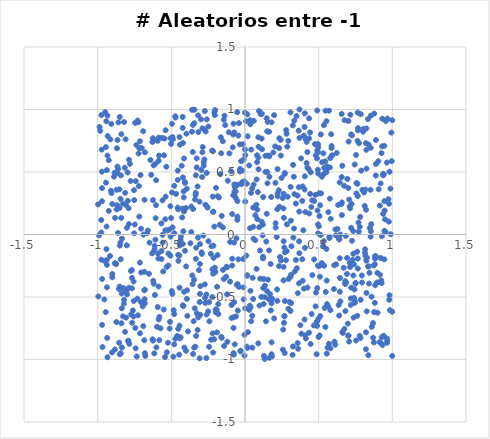
| Category | Y |
|---|---|
| 0.2941494130794362 | 0.749 |
| 0.5414493482163687 | -0.588 |
| 0.8208104533130691 | 0.731 |
| -0.7924378228535878 | -0.849 |
| 0.5660289205656317 | 0.179 |
| -0.2671827902955777 | 0.824 |
| 0.3671700671999589 | -0.055 |
| 0.8987338431680711 | -0.307 |
| -0.6790496207109624 | 0.658 |
| -0.9439417812696314 | 0.7 |
| 0.9457393925962683 | -0.199 |
| -0.4373616848154729 | -0.043 |
| -0.07798164039639421 | 0.886 |
| 0.23072688172821088 | -0.253 |
| -0.7129389091545362 | 0.746 |
| -0.5231780994365782 | -0.866 |
| 0.04167682645095594 | 0.679 |
| 0.5013568381594551 | 0.066 |
| 0.2946855053844022 | -0.594 |
| 0.7658177464501605 | -0.192 |
| -0.31884595823467743 | -0.025 |
| 0.6163008782579018 | -0.007 |
| -0.5589206364381119 | -0.003 |
| 0.4748370309225174 | 0.723 |
| 0.6922112292820968 | -0.316 |
| -0.43473672491951443 | -0.016 |
| 0.6858875232697872 | -0.383 |
| 0.5923150215027637 | 0.633 |
| 0.49559760242313455 | 0.081 |
| 0.5759438931337597 | 0.287 |
| -0.3178183942800692 | 0.953 |
| 0.05641747083701021 | 0.062 |
| 0.5304703597563405 | -0.092 |
| 0.8079325371352861 | 0.336 |
| -0.2948543363129059 | -0.143 |
| -0.32188102782502304 | 0.384 |
| 0.0901054042940097 | -0.871 |
| -0.5389449371655033 | 0.834 |
| 0.5347108882758353 | 0.483 |
| 0.5848068977406009 | 0.802 |
| 0.9645657466205084 | -0.834 |
| 0.24796686821780445 | 0.453 |
| 0.36860751882657894 | -0.15 |
| -0.9697983240072179 | -0.356 |
| -0.4072869910445944 | -0.13 |
| 0.34956815488259885 | 0.947 |
| 0.007054451618637048 | 0.906 |
| 0.8604706242656734 | -0.739 |
| -0.3270904979770859 | -0.63 |
| 0.22936429356155363 | 0.354 |
| -0.9702967598521233 | 0.371 |
| 0.1514140917897564 | 0.5 |
| -0.5406096847180217 | 0.034 |
| 0.7131013687680712 | -0.26 |
| -0.9244185582309628 | 0.188 |
| -0.8004876663058214 | -0.479 |
| -0.9332747468915192 | 0.631 |
| 0.7204610522994797 | 0.8 |
| -0.2161044862942112 | 0.181 |
| -0.48627947891581647 | -0.977 |
| -0.8714737017085814 | 0.358 |
| 0.8764794807394773 | -0.621 |
| -0.2084166517363104 | 0.063 |
| 0.9287063329001071 | -0.014 |
| 0.88772011152882 | 0.472 |
| 0.6836709033454063 | -0.011 |
| -0.10577644653767404 | 0.649 |
| -0.7132605972327757 | -0.225 |
| 0.0013785702516131426 | 0.264 |
| -0.8833312912085758 | -0.229 |
| 0.5738703648616248 | -0.018 |
| 0.7928659448768893 | -0.328 |
| 0.3573833167143916 | -0.868 |
| 0.2693691020571214 | -0.948 |
| -0.9725147209216434 | 0.679 |
| 0.33480268678534086 | 0.911 |
| 0.3355167295967101 | 0.323 |
| 0.0702704360791937 | 0.154 |
| -0.7415804376125115 | 0.427 |
| -0.8819305192997813 | 0.133 |
| 0.9989290111648346 | -0.618 |
| -0.34280294161997515 | 0.998 |
| 0.49452638566962714 | 0.724 |
| 0.7010940298745183 | -0.808 |
| 0.6699284308734952 | -0.266 |
| -0.35735726047236915 | -0.327 |
| 0.1780601958300121 | 0.3 |
| -0.5015936511686496 | 0.132 |
| -0.0033845683994755404 | -0.802 |
| -0.3281288050563784 | 0.536 |
| 0.5878899123216339 | 0.708 |
| -0.03274545779325022 | 0.524 |
| -0.8523883184804628 | 0.361 |
| -0.06931753221383197 | -0.879 |
| 0.12866613361052592 | -0.972 |
| -0.8219231337582773 | -0.554 |
| -0.10080917151735447 | -0.059 |
| 0.8407396339160662 | -0.255 |
| 0.31146610487606696 | 0.111 |
| -0.5676426134254695 | 0.088 |
| 0.7633102596971277 | 0.406 |
| 0.028574259294429805 | -0.603 |
| -0.5866596318878008 | -0.416 |
| 0.9332915562173341 | -0.884 |
| 0.011979607241968226 | 0.406 |
| 0.7351104742186261 | -0.154 |
| -0.15044991178704636 | 0.746 |
| -0.07210795115514634 | 0.401 |
| 0.9557779598713079 | 0.908 |
| 0.14744043795579986 | 0.166 |
| -0.5012336067100376 | 0.725 |
| -0.17204240914324886 | 0.078 |
| 0.8126387245789706 | 0.229 |
| -0.13899645886734602 | 0.95 |
| 0.736997108781061 | -0.665 |
| -0.7291420319080582 | 0.912 |
| 0.43133307587631275 | 0.524 |
| 0.0012385483504593342 | -0.591 |
| -0.6904648629504171 | -0.733 |
| -0.4952569459788645 | 0.885 |
| -0.3997298236667757 | -0.255 |
| 0.38062238974700024 | 0.609 |
| 0.6815513358850109 | -0.612 |
| 0.2044713037266217 | 0.705 |
| -0.35416771838566063 | 0.66 |
| 0.7021365197299614 | 0.908 |
| 0.6758531517969757 | 0.915 |
| -0.8653099374213666 | 0.756 |
| -0.8157605110711752 | 0.534 |
| -0.8421113068447197 | 0.473 |
| 0.434208232194895 | -0.786 |
| 0.49657766488010324 | 0.009 |
| 0.49040131870418535 | -0.429 |
| -0.7547878223694957 | -0.532 |
| 0.23393698745245328 | 0.222 |
| 0.29575547337516417 | -0.356 |
| 0.4526375677129286 | -0.636 |
| -0.7874529708112661 | 0.598 |
| -0.41844732509718696 | 0.026 |
| -0.36460715351106354 | 0.019 |
| -0.765746533767899 | -0.706 |
| -0.004711407466996942 | 0.425 |
| -0.8366640728620827 | -0.472 |
| 0.3453342777184427 | 0.248 |
| -0.6305666209458503 | -0.151 |
| 0.5163394727606188 | 0.329 |
| 0.962827926247791 | 0.576 |
| 0.6574568843754054 | 0.155 |
| -0.2589509817931628 | 0.225 |
| -0.5858090166204573 | 0.59 |
| -0.06147509578301569 | -0.655 |
| 0.12212526202574092 | -0.178 |
| 0.4046856789335114 | 0.359 |
| -0.9745837103797226 | 0.955 |
| -0.029614888024345642 | -0.929 |
| 0.06951572874897383 | -0.045 |
| -0.4210857373163681 | 0.732 |
| -0.9972209202026208 | 0.241 |
| -0.4531974818429354 | -0.755 |
| 0.2209677186046446 | 0.523 |
| 0.0983100606133942 | -0.568 |
| -0.8349275044207383 | -0.033 |
| 0.9378113821919136 | 0.165 |
| -0.29065566617032124 | 0.46 |
| 0.7659377112046553 | -0.272 |
| -0.2928155157093091 | -0.156 |
| 0.219049707893598 | 0.202 |
| -0.18957813863346806 | -0.783 |
| 0.6568446798789043 | 0.459 |
| 0.23333163008629998 | 0.77 |
| -0.14936066871321763 | -0.283 |
| 0.0553566992657597 | -0.516 |
| 0.4095257327356905 | -0.807 |
| -0.7851903944160497 | -0.875 |
| -0.2598987013655405 | 0.493 |
| -0.07342639757615865 | 0.817 |
| -0.736709142227757 | 0.715 |
| -0.4446067214718925 | -0.73 |
| -0.3058007101448552 | -0.236 |
| -0.3351724174825075 | 0.317 |
| -0.16742701348701794 | 0.483 |
| -0.2692857283388703 | 0.238 |
| 0.6437812750708298 | -0.458 |
| 0.7881913678978303 | 0.511 |
| 0.1978693567442289 | 0.955 |
| -0.46787237360164413 | 0.325 |
| 0.38878532589503423 | -0.198 |
| 0.8967410030158152 | -0.384 |
| -0.44539266880183526 | -0.168 |
| 0.4902682691923286 | -0.693 |
| 0.5084637023227156 | -0.338 |
| -0.6647255493049915 | 0.011 |
| 0.5353198469675113 | 0.874 |
| -0.4567885995501002 | 0.215 |
| 0.5656676650799637 | -0.576 |
| 0.9204727914920099 | 0.409 |
| -0.9954708641485539 | -0.496 |
| 0.09175033486806217 | 0.522 |
| -0.8091956248623642 | 0.237 |
| -0.044956538631860665 | 0.792 |
| 0.09659416664685039 | 0.058 |
| 0.32480664033373285 | 0.873 |
| -0.05281644905485927 | 0.979 |
| -0.5856328510474915 | 0.775 |
| 0.11381467846516635 | 0.102 |
| -0.8657678068550723 | 0.543 |
| 0.1504218978563865 | 0.825 |
| -0.3443556614001748 | 0.89 |
| -0.7561492785144592 | -0.376 |
| -0.6193630913185058 | 0.756 |
| 0.26784705592783653 | -0.655 |
| 0.41285736701166953 | -0.832 |
| -0.5049326166747421 | -0.017 |
| -0.9439764218751125 | 0.415 |
| -0.7872159740249809 | -0.426 |
| 0.5449583491771164 | 0.585 |
| -0.060482224239664095 | 0.288 |
| -0.8239061912474623 | -0.43 |
| -0.3872533731981853 | -0.775 |
| -0.659441917833709 | 0.032 |
| -0.4161126555911392 | 0.345 |
| -0.8712022629372183 | 0.201 |
| -0.624052747321258 | -0.849 |
| 0.35685539159960067 | 0.312 |
| 0.7503142433664463 | -0.393 |
| -0.2213612156217939 | -0.279 |
| 0.2898021834848481 | 0.302 |
| 0.4364266611400045 | 0.168 |
| -0.550189377908965 | 0.634 |
| -0.05165452222863265 | 0.267 |
| 0.11394104110349312 | 0.966 |
| -0.20087763147829008 | -0.299 |
| -0.20435672306786912 | -0.266 |
| -0.5626055963799041 | 0.773 |
| -0.07190155389811381 | 0.315 |
| -0.541217755216683 | 0.122 |
| 0.44638941227204154 | 0.497 |
| 0.8270604397528845 | -0.186 |
| -0.05599529070161968 | -0.402 |
| -0.39422526611958375 | -0.515 |
| 0.7788913285174874 | -0.811 |
| 0.2648904651487871 | -0.707 |
| 0.570212026823921 | -0.875 |
| -0.5339331442394069 | 0.542 |
| 0.9267245588470863 | 0.651 |
| 0.2153554116039187 | -0.02 |
| 0.4062158769240998 | 0.465 |
| -0.06307819646508706 | 0.345 |
| -0.26231607583653394 | -0.988 |
| 0.41103777309896117 | 0.764 |
| -0.4726825110515869 | 0.945 |
| 0.720841257033328 | -0.425 |
| -0.1983188927238242 | -0.623 |
| 0.7857239576159991 | 0.963 |
| 0.6277978374705198 | 0.044 |
| -0.8502936939734458 | -0.959 |
| 0.8237057517691786 | -0.209 |
| -0.8433332293289701 | -0.198 |
| -0.9547504281597816 | -0.519 |
| 0.30908383606617296 | -0.612 |
| 0.7786659293482008 | 0.062 |
| -0.4227001667323189 | 0.853 |
| -0.07598765835515509 | -0.961 |
| -0.18941257382971477 | -0.418 |
| -0.8447515357196853 | 0.285 |
| 0.6930337091831447 | -0.188 |
| -0.6033378375986787 | 0.435 |
| -0.42144481548381085 | -0.566 |
| -0.7520456727357983 | 0.01 |
| 0.6464385775638337 | 0 |
| 0.2821801345041932 | 0.806 |
| 0.7837779396507254 | -0.828 |
| 0.48610527520731184 | -0.958 |
| -0.49263664742340296 | 0.779 |
| -0.4176769739682664 | -0.573 |
| -0.8209951082866698 | 0.9 |
| -0.47288639768549623 | -0.834 |
| -0.09156903607088784 | -0.564 |
| -0.44229344665169323 | -0.087 |
| -0.8541525070628351 | -0.866 |
| 0.5731714208878256 | -0.028 |
| -0.9753771909443314 | 0.116 |
| -0.3590107713094286 | 0.998 |
| 0.08189144584670993 | 0.634 |
| -0.3342093444684098 | 0.333 |
| 0.2592216435234116 | -0.76 |
| -0.42201738440349024 | -0.075 |
| 0.821627093574828 | 0.198 |
| -0.08046514692905538 | 0.8 |
| -0.8455943444698235 | -0.065 |
| 0.36986794349497876 | 1 |
| -0.3938768236338488 | -0.447 |
| 0.4778114201472372 | 0.317 |
| 0.19234402082711788 | 0.656 |
| 0.10240375269366742 | -0.128 |
| 0.12257927327912155 | -0.191 |
| -0.9381952695860551 | -0.204 |
| -0.511511367703344 | -0.753 |
| 0.21922985988034438 | -0.531 |
| -0.1967385770812935 | 0.374 |
| -0.4539777623047363 | 0.202 |
| -0.05225063448173528 | 0.117 |
| 0.9994935783152501 | -0.972 |
| -0.7203235962750827 | 0.387 |
| -0.3913691376804662 | -0.651 |
| -0.21730980118497745 | 0.667 |
| -0.9496401387413953 | -0.214 |
| 0.10533228398069872 | 0.976 |
| 0.3094316002870161 | 0.381 |
| -0.2429258943304493 | -0.542 |
| 0.6374323181789967 | -0.035 |
| 0.09072592424952841 | 0.778 |
| 0.30862059439581446 | 0.977 |
| 0.7570584339500899 | 0.412 |
| -0.3074132073632121 | -0.54 |
| 0.815559440663715 | -0.118 |
| -0.3977081859478442 | 0.807 |
| 0.9210097549444058 | -0.187 |
| -0.0240348924454985 | 0.403 |
| -0.709031973372122 | 0.476 |
| 0.753770455226993 | 0.636 |
| -0.8784229830823524 | -0.232 |
| 0.9163054736085285 | -0.323 |
| 0.034615231132977264 | 0.05 |
| -0.30563791663767503 | -0.475 |
| 0.41883171214721426 | 0.741 |
| -0.9672321340983536 | -0.901 |
| -0.7512849654586728 | 0.275 |
| 0.26410019026283216 | 0.134 |
| -0.7456759694307127 | 0.892 |
| 0.6037756476743443 | -0.436 |
| 0.4971961594902168 | 0.488 |
| -0.47203449850234125 | 0.935 |
| 0.7503727482676967 | -0.387 |
| -0.30524600071414554 | -0.077 |
| -0.03458534732362262 | 0.504 |
| 0.3883459816459238 | 0.269 |
| 0.9808270637850387 | 0.502 |
| 0.16954768220129757 | -0.477 |
| 0.6807283333832903 | -0.373 |
| -0.849908184476055 | 0.94 |
| 0.17989804761668826 | 0.897 |
| -0.41391218159735477 | 0.185 |
| -0.6245971266471622 | 0.275 |
| -0.05001515490723096 | -0.397 |
| -0.3315570744716385 | -0.812 |
| -0.3334998466834087 | -0.195 |
| -0.01921618772712219 | 0.419 |
| -0.28906393667412833 | 0.658 |
| 0.014877917608587587 | -0.329 |
| -0.6194725528276466 | -0.394 |
| 0.07850686597029055 | -0.275 |
| -0.2184956490752008 | 0.303 |
| 0.05184904878807406 | -0.347 |
| 0.8389900812892421 | 0.72 |
| -0.3086625337576392 | 0.262 |
| 0.6638835913806573 | -0.788 |
| 0.8236536781464967 | 0.678 |
| -0.8595032613202516 | 0.897 |
| -0.9138505061034559 | 0.761 |
| -0.12195393944669375 | -0.478 |
| -0.5810268533431346 | -0.659 |
| 0.5020343807622802 | 0.33 |
| 0.9283716437912868 | -0.822 |
| -0.21638783584373278 | -0.944 |
| -0.5736716533731709 | -0.751 |
| 0.2792862064149584 | 0.835 |
| 0.7133571340892131 | 0.21 |
| -0.25409796572310817 | 0.215 |
| -0.7307349971489903 | -0.514 |
| 0.48917168337572803 | -0.731 |
| 0.9789049352385459 | -0.523 |
| 0.15035554024018105 | -0.454 |
| -0.8362321804344273 | -0.59 |
| -0.4423253312877615 | -0.063 |
| -0.18627887583635183 | -0.164 |
| 0.6189715561525269 | -0.239 |
| 0.49482288420416976 | -0.25 |
| -0.6062920085346954 | 0.131 |
| 0.5799731256334355 | -0.91 |
| -0.08695678541452079 | 0.164 |
| 0.6536869394214835 | 0.242 |
| -0.5302085588700349 | -0.943 |
| -0.42345883730791 | 0.207 |
| 0.4791887944509694 | -0.575 |
| 0.10692245682878876 | 0.963 |
| -0.2713820056760301 | -0.506 |
| 0.25732831102535747 | -0.921 |
| -0.414195963027274 | 0.608 |
| -0.6817491785638523 | 0.278 |
| -0.5309255858875341 | -0.259 |
| 0.7848931802978591 | -0.522 |
| -0.5428859669827077 | -0.98 |
| 0.1656633676340582 | 0.462 |
| -0.27521666416519075 | 0.6 |
| 0.4452984991581257 | -0.876 |
| 0.31229447643765895 | -0.322 |
| 0.8526620707244446 | -0.017 |
| 0.7649415713750669 | 0.975 |
| 0.120911949233244 | 0.079 |
| -0.8431505910956987 | -0.95 |
| -0.7898846540723561 | 0.21 |
| 0.09498089007938226 | 0.988 |
| -0.45212648153748125 | -0.211 |
| -0.2142989899994634 | -0.089 |
| -0.36393311037800347 | 0.223 |
| -0.3947948746115848 | 0.366 |
| -0.3450562603723746 | -0.362 |
| 0.24240685836413878 | 0.757 |
| -0.43743871678284996 | -0.822 |
| -0.13409749823450956 | 0.875 |
| -0.04520706253266793 | -0.199 |
| -0.5387170462136568 | 0.302 |
| 0.11933012092379891 | -0.007 |
| 0.4424538805957918 | 0.816 |
| -0.9373312928435256 | -0.243 |
| 0.8887426139215766 | 0.756 |
| 0.2217424722789041 | 0.305 |
| -0.5970945080387049 | -0.738 |
| -0.7233263505065122 | 0.899 |
| 0.5617900857890357 | 0.535 |
| -0.8830514223104982 | -0.921 |
| 0.8691785659327982 | -0.709 |
| 0.7703385925887207 | 0.096 |
| 0.914782554201983 | 0.231 |
| 0.2619961410795002 | -0.259 |
| -0.3124004132279312 | -0.285 |
| 0.12355464894359769 | 0.3 |
| 0.36067092215484853 | -0.914 |
| -0.3525272499901342 | 0.204 |
| -0.35983573079048226 | 0.823 |
| 0.555375052503482 | 0.544 |
| 0.7619339654628912 | -0.651 |
| 0.9737019535251428 | 0.282 |
| 0.1559659592366014 | -0.361 |
| 0.6727354762739677 | 0.39 |
| 0.13539976865727898 | -0.41 |
| 0.09194236020621638 | 0.702 |
| 0.8739481440438344 | -0.248 |
| -0.415792827133979 | 0.297 |
| 0.9418089738519253 | 0.483 |
| 0.5480849815031552 | -0.459 |
| -0.3390231728982276 | 0.281 |
| 0.8881016248729545 | -0.173 |
| -0.48901955681000087 | 0.763 |
| 0.3683603293461637 | 0.184 |
| 0.39130291033523856 | 0.385 |
| -0.8104233436805461 | 0.762 |
| 0.767398650680811 | 0.851 |
| -0.3412335878561945 | -0.591 |
| -0.33142036821618337 | -0.106 |
| -0.24774985133552963 | -0.054 |
| -0.19933146764901366 | -0.599 |
| -0.6286156477165876 | 0.74 |
| 0.8592584247133572 | -0.497 |
| 0.060062359162696755 | 0.91 |
| -0.813017856069753 | 0.333 |
| 0.5376184223803071 | 0.533 |
| 0.4233945213108252 | 0.537 |
| -0.6834581303393952 | -0.846 |
| -0.026247942163679427 | 0.587 |
| 0.49043519238349487 | 0.672 |
| 0.8343633537132502 | 0.923 |
| 0.8529204859359096 | 0.694 |
| 0.26232034835065776 | -0.054 |
| 0.1757833512568363 | -0.607 |
| 0.6445899306957517 | -0.348 |
| -0.7566530865220191 | -0.656 |
| -0.015051968187147935 | 0.722 |
| 0.9045713345004172 | 0.586 |
| -0.21576475292940822 | -0.313 |
| 0.38258901671004986 | -0.794 |
| 0.2667851325578272 | -0.104 |
| -0.6147112086339728 | -0.122 |
| 0.8260283405691926 | -0.615 |
| 0.18019257025230462 | -0.55 |
| 0.8139833151670484 | -0.147 |
| -0.1501728292073916 | 0.057 |
| 0.08745172829828407 | 0.339 |
| 0.7233449576578788 | 0.244 |
| 0.8350865673631684 | -0.256 |
| -0.6514155188442963 | -0.314 |
| -0.491514281056904 | 0.057 |
| 0.9378102313001986 | 0.485 |
| -0.12765911965725785 | -0.338 |
| 0.9959430078266365 | 0.587 |
| 0.6602294856516504 | -0.781 |
| 0.9759847556318069 | 0.103 |
| 0.6407330919358296 | -0.039 |
| -0.7220575590229785 | 0.648 |
| 0.4000098486260033 | 0.791 |
| 0.7352700066627915 | -0.327 |
| 0.8544199835552748 | 0.026 |
| -0.03492205523372194 | 0.721 |
| 0.9315649934069326 | 0.926 |
| -0.9009471524532204 | 0.244 |
| 0.6228250597333644 | 0.652 |
| -0.5833203608974658 | 0.631 |
| -0.6914133895212475 | 0.826 |
| 0.5544715113523417 | -0.369 |
| -0.5817865750277245 | -0.845 |
| 0.49900224050192543 | -0.819 |
| -0.018444926383609506 | 0.51 |
| 0.03777487084240416 | -0.584 |
| -0.15773229049867576 | 0.148 |
| -0.20913873924888415 | -0.838 |
| 0.18038793551035082 | -0.958 |
| -0.647802658958671 | -0.065 |
| 0.9139079998571966 | -0.861 |
| 0.04899074968598738 | 0.368 |
| -0.08688056453879511 | -0.194 |
| 0.165027332784085 | -0.986 |
| -0.3171279801253042 | -0.664 |
| 0.545766056030023 | -0.74 |
| -0.07437482802761175 | -0.064 |
| -0.4801073326058318 | -0.637 |
| 0.23154450186696818 | 0.691 |
| -0.8203238594583488 | -0.523 |
| -0.7069162820808017 | -0.54 |
| -0.7171662709097808 | 0.69 |
| -0.9025347616876653 | -0.944 |
| 0.22110747026254218 | 0.329 |
| 0.2708640446291959 | -0.532 |
| -0.5857727978708243 | -0.679 |
| 0.7562706107666572 | 0.329 |
| -0.5550773773568551 | -0.295 |
| -0.982672669277481 | 0.829 |
| -0.6794357641017446 | -0.441 |
| 0.6976686011847242 | -0.713 |
| 0.6605026418107283 | 0.55 |
| 0.5553846152176294 | -0.953 |
| 0.16196115705031833 | -0.518 |
| 0.9255046123213315 | -0.368 |
| 0.9649437139192558 | -0.866 |
| -0.21547595434867084 | 0.183 |
| -0.6953785539487412 | -0.55 |
| -0.600986829870011 | -0.903 |
| 0.15342485899345282 | 0.901 |
| 0.7034855357899714 | 0.743 |
| -0.048436527112496686 | -0.609 |
| 0.4350973144724424 | 0.929 |
| -0.8072586840464173 | -0.665 |
| -0.1435810329006546 | -0.356 |
| -0.3041099325004739 | -0.643 |
| -0.2199837970501528 | -0.791 |
| -0.6795050048326639 | -0.95 |
| 0.057575391299759415 | -0.034 |
| 0.731113785754316 | -0.203 |
| -0.9076018583028147 | 0.885 |
| -0.7966948042164015 | 0.496 |
| -0.00039547579279219924 | 0.975 |
| 0.5603526412057465 | -0.905 |
| 0.3151532933246197 | -0.094 |
| 0.42337633520307216 | 0.659 |
| -0.5205083662408714 | -0.248 |
| -0.23221528557467752 | -0.155 |
| 0.5373036350374121 | -0.25 |
| -0.9395345865207192 | 0.063 |
| 0.35214447039029073 | -0.269 |
| 0.84469811334921 | -0.307 |
| -0.9008023028856784 | -0.342 |
| -0.21328818304639663 | -0.187 |
| 0.8423213077887026 | -0.393 |
| 0.331787495522029 | 0.462 |
| 0.5466135499192997 | 0.991 |
| 0.8807709332257287 | -0.239 |
| 0.002053280327916518 | 0.635 |
| 0.46938183079580087 | -0.2 |
| -0.5515672597652863 | -0.6 |
| 0.3698531773135587 | 0.773 |
| -0.9708850251446584 | 0.502 |
| -0.05810173903153815 | -0.031 |
| -0.22186998516310585 | -0.501 |
| 0.8772477439773676 | 0.968 |
| -0.5144085340114668 | 0.039 |
| -0.6898562922284801 | -0.001 |
| -0.07234804456364197 | -0.542 |
| -0.8516644583713613 | 0.212 |
| 0.2831257418280113 | -0.133 |
| -0.2026842947473515 | 0.996 |
| 0.5795432845809865 | -0.605 |
| 0.40016164891222683 | -0.433 |
| 0.03648726011773307 | 0.882 |
| -0.7670393061947518 | -0.431 |
| 0.7721415958855167 | 0.022 |
| 0.4989520488190038 | -0.673 |
| -0.8854019882420301 | 0.494 |
| 0.7398502439238503 | -0.508 |
| 0.6475259286817181 | -0.535 |
| 0.7638090946468259 | 0.748 |
| 0.0373033775797198 | -0.451 |
| 0.5878034705402286 | 0.629 |
| 0.8755019219219811 | -0.864 |
| -0.8277381529675816 | -0.655 |
| 0.45022738033566534 | 0.219 |
| 0.854335890223582 | 0.951 |
| 0.5144589097577303 | 0.801 |
| -0.19218733460242476 | -0.602 |
| -0.2967080209293489 | 0.516 |
| 0.26139129037786146 | -0.367 |
| 0.40431208774549243 | -0.68 |
| 0.3332629812618022 | 0.048 |
| -0.33332438038888834 | 0.474 |
| 0.8241874457736333 | 0.848 |
| 0.7156266847608905 | 0.958 |
| 0.9071331391750039 | 0.362 |
| -0.17746109851721492 | 0.296 |
| -0.41318801301764574 | -0.458 |
| 0.3664843815985397 | -0.39 |
| 0.48170656218424557 | -0.465 |
| 0.028791507494761337 | 0.553 |
| 0.2378684644278113 | -0.18 |
| 0.5147478158216401 | -0.004 |
| 0.6322072511205976 | 0.236 |
| 0.3919605507089008 | -0.37 |
| 0.02026922662124675 | -0.781 |
| 0.07702630679745637 | 0.238 |
| 0.5052255028628754 | -0.252 |
| 0.16294171594206563 | -0.127 |
| 0.9933103718787695 | 0.815 |
| 0.3026001479321405 | -0.539 |
| 0.9462525295875082 | 0.267 |
| 0.2846754917251382 | 0.081 |
| -0.6831868781435051 | -0.446 |
| -0.28048219842145783 | 0.578 |
| -0.0827119370931666 | 0.698 |
| -0.94532652273677 | -0.62 |
| 0.5525080401894971 | -0.116 |
| -0.5060976875303158 | -0.169 |
| 0.11307632253074784 | 0.768 |
| 0.820864072403273 | -0.918 |
| 0.3229319309367076 | -0.963 |
| 0.6357007117268261 | -0.565 |
| -0.0422207710244098 | -0.419 |
| 0.13404059953590286 | -0.996 |
| -0.47953266169528286 | 0.01 |
| -0.49544720511832274 | 0.336 |
| -0.42609865326397345 | 0.137 |
| -0.011958241081368115 | -0.197 |
| 0.364520543942199 | 0.83 |
| 0.9775606404644068 | 0.246 |
| -0.6825944566422364 | -0.298 |
| -0.7916814783393078 | -0.854 |
| -0.9062348880804392 | 0.331 |
| -0.8689999985881334 | 0.69 |
| -0.7882078585244068 | 0.083 |
| 0.576330084752186 | 0.536 |
| 0.9272863589286422 | -0.39 |
| 0.09091179334063626 | 0.616 |
| 0.7447126825091916 | 0.56 |
| 0.08185940074075004 | 0.579 |
| 0.14708704109731063 | 0.93 |
| -0.7610141628199627 | -0.607 |
| -0.7054301842625641 | 0.046 |
| -0.28908066737263494 | 0.85 |
| 0.8175927841047184 | 0.36 |
| 0.11153992022247294 | -0.499 |
| 0.6072910873357864 | -0.857 |
| 0.04081050860006452 | 0.333 |
| -0.8015057092037232 | 0.054 |
| -0.4295598487969734 | 0.55 |
| 0.5874859801941983 | 0.692 |
| 0.8831968290622629 | -0.406 |
| 0.7735629155573827 | 0.731 |
| 0.7342515203384672 | 0.028 |
| -0.840048028846109 | 0.133 |
| -0.5090916022677949 | -0.699 |
| 0.056148287570521704 | 0.215 |
| -0.008660953315931419 | -0.52 |
| 0.4885371053846508 | 0.609 |
| -0.42130237960751105 | 0.456 |
| -0.40060704024058813 | -0.93 |
| 0.07951503887448141 | 0.441 |
| -0.9162251101876349 | -0.172 |
| 0.365729787562284 | 0.378 |
| 0.26876066885144345 | 0.484 |
| 0.2699297249670889 | 0.492 |
| 0.9421728964443361 | -0.81 |
| 0.7433254204204123 | -0.44 |
| 0.033881511518095264 | 0.915 |
| -0.37031599002572224 | -0.07 |
| 0.5782441417366022 | 0.611 |
| -0.26205927292940867 | -0.48 |
| -0.07793897562523533 | -0.747 |
| 0.7185027691151598 | -0.511 |
| -0.4441606302384171 | 0.779 |
| 0.8817358322766959 | -0.174 |
| -0.8498787102179568 | -0.089 |
| -0.45384987639460683 | -0.163 |
| 0.7667344823413329 | 0.834 |
| 0.1277108526558559 | -0.356 |
| 0.712232203458405 | -0.228 |
| -0.09375915409505531 | 0.506 |
| -0.9354992542925711 | -0.828 |
| 0.7453716844328717 | -0.546 |
| -0.4468445492245854 | -0.962 |
| 0.5318250903239083 | 0.649 |
| 0.7024780494789551 | -0.81 |
| -0.7173145464550417 | 0.143 |
| -0.4414928713425996 | 0.718 |
| -0.29837329827607584 | 0.922 |
| 0.18289506971268765 | -0.975 |
| 0.856778580759582 | 0.082 |
| -0.2604698486717645 | -0.641 |
| 0.7103850390947917 | 0.225 |
| -0.04090760546488448 | 0.891 |
| 0.30955213590069186 | -0.336 |
| 0.40426167118122835 | 0.86 |
| -0.7127307837038397 | -0.79 |
| -0.8393392689368315 | 0.802 |
| 0.2561146281635298 | 0.292 |
| 0.32824488834773313 | -0.025 |
| -0.2727770309147499 | -0.399 |
| -0.030659541518074374 | -0.934 |
| 0.13946217055501386 | 0.501 |
| -0.8738412971996192 | -0.236 |
| 0.8023547406668852 | 0.823 |
| 0.5234010274736396 | 0.578 |
| 0.753579713039503 | -0.848 |
| 0.0834819408677614 | 0.199 |
| 0.7068802627520185 | -0.856 |
| -0.5879737653377193 | -0.192 |
| 0.6576176603769064 | 0.257 |
| -0.4563802616959709 | 0.511 |
| -0.5665675389603018 | -0.197 |
| 0.17375898830033254 | -0.235 |
| 0.8245947242155645 | 0.527 |
| -0.8385122808391183 | -0.71 |
| -0.0794727595490381 | 0.314 |
| 0.008985585822282705 | -0.169 |
| 0.358758375822708 | -0.469 |
| 0.9649290211922279 | -0.849 |
| -0.18065080616133966 | -0.636 |
| 0.45707843807168946 | -0.325 |
| 0.9807020790501633 | -0.486 |
| -0.227276856610926 | -0.094 |
| 0.11554439475414835 | 0.682 |
| 0.18031453127638253 | -0.863 |
| -0.8682086734202665 | 0.235 |
| 0.9478673160654787 | 0.192 |
| 0.5569273636530179 | -0.557 |
| -0.4838828721180868 | -0.605 |
| 0.4180884288992408 | 0.571 |
| 0.40951465948058785 | 0.18 |
| 0.7070599491194518 | 0.28 |
| -0.2688839961706826 | -0.548 |
| -0.9742676693891732 | -0.202 |
| 0.9213024683990434 | -0.867 |
| -0.4562442168342249 | 0.437 |
| -0.5202033333437952 | -0.152 |
| -0.4445269014967186 | -0.425 |
| -0.6038912707798421 | 0.235 |
| 0.4703270870225389 | 0.267 |
| 0.20797747072611394 | 0.09 |
| 0.9871185290554971 | 0.367 |
| 0.9546851384150266 | 0.02 |
| 0.7011054568770438 | 0.372 |
| 0.6128397849911453 | -0.881 |
| -0.16090639275364937 | -0.82 |
| -0.6230006159447348 | -0.37 |
| 0.5109641606766229 | -0.653 |
| 0.6951524200923467 | 0.444 |
| -0.8185353078889905 | -0.441 |
| -0.41148330928493415 | -0.905 |
| -0.48019213247471515 | -0.878 |
| -0.16441614085174017 | 0.778 |
| -0.3027127467224491 | -0.413 |
| 0.013592690060580281 | -0.326 |
| 0.14224453304481655 | -0.695 |
| -0.774321064746142 | -0.291 |
| 0.018191622520362438 | 0.786 |
| 0.8371831140205115 | -0.966 |
| -0.5462189330881619 | 0.768 |
| -0.5058200656338552 | 0.769 |
| 0.7262108607806963 | 0.793 |
| 0.5527602619411638 | 0.907 |
| 0.781725011735606 | 0.141 |
| -0.4607582389029399 | -0.812 |
| 0.7262359788009658 | -0.05 |
| 0.8520011229789646 | 0.358 |
| -0.35277634321541274 | 0.877 |
| -0.0033749383405183853 | -0.969 |
| -0.6766088919981106 | -0.972 |
| 0.4673698896201057 | -0.727 |
| -0.970282940100393 | 0.266 |
| 0.7199516878908416 | 0.053 |
| 0.6820355847977013 | -0.394 |
| -0.04965517275710973 | 0.398 |
| 0.015201274121802388 | 0.962 |
| -0.07787092587482825 | -0.663 |
| 0.7395779216088452 | -0.239 |
| -0.7763607208602192 | 0.428 |
| 0.9988127706654155 | 0.914 |
| 0.9666817325291317 | 0.927 |
| -0.9484947082259094 | 0.979 |
| 0.6425066613534709 | 0.416 |
| 0.08383534970476725 | 0.123 |
| 0.49718017383156266 | 0.698 |
| 0.2079571255933379 | 0.055 |
| -0.780574462136777 | 0.565 |
| 0.19773652110237294 | -0.671 |
| -0.7425713188031127 | -0.911 |
| 0.4351091061687511 | 0.77 |
| -0.7266384142389073 | -0.646 |
| 0.3263129231335091 | 0.557 |
| -0.7344594645548232 | -0.976 |
| 0.407148592415322 | -0.107 |
| 0.7964031044083597 | 0.357 |
| -0.2046830573441869 | 0.955 |
| 0.4877474525938148 | -0.696 |
| 0.5212844442830447 | -0.228 |
| 0.04195795359871535 | -0.694 |
| -0.7441653391124659 | -0.747 |
| -0.9908516610182692 | -0.007 |
| -0.12351775990033564 | -0.263 |
| -0.3079823180619994 | -0.99 |
| -0.18168611833014192 | -0.556 |
| 0.5526385319037677 | 0.499 |
| 0.03310722448554504 | -0.569 |
| -0.22358374315764862 | 0.671 |
| -0.0693868125125483 | 0.378 |
| 0.7654939126806728 | 0.307 |
| -0.28671484519627444 | 0.7 |
| 0.40579231653717507 | 0.969 |
| -0.1616428707769193 | 0.65 |
| -0.6942760245475323 | -0.575 |
| 0.12400821717215993 | -0.428 |
| 0.016494109393235368 | -0.908 |
| 0.8178967662039822 | -0.172 |
| -0.15794675254854562 | -0.827 |
| 0.9456877753655579 | 0.709 |
| -0.7530862963322391 | 0.354 |
| -0.22989648393583018 | -0.842 |
| 0.1638194986954602 | 0.822 |
| -0.590537694801468 | -0.152 |
| -0.24852975932644727 | 0.864 |
| -0.35566940961049087 | -0.396 |
| -0.11686683472030546 | 0.43 |
| 0.6055215276756711 | -0.246 |
| -0.0909969389413583 | -0.667 |
| -0.7723510428621316 | -0.64 |
| 0.7182130623826095 | -0.564 |
| 0.13914038223611258 | 0.629 |
| -0.2725625277932491 | 0.987 |
| -0.2803946682016145 | 0.551 |
| 0.8700157232597072 | -0.826 |
| 0.8812801800914105 | -0.547 |
| -0.6130793151754006 | -0.092 |
| -0.8354967347657294 | -0.904 |
| -0.008853184792847024 | 0.6 |
| -0.32144886171927434 | -0.763 |
| 0.2435610554999128 | 0.631 |
| -0.8509732274404997 | -0.416 |
| 0.27833881391273607 | -0.206 |
| 0.5220133346194846 | 0.462 |
| -0.7672739574601402 | -0.347 |
| 0.39567435894913583 | 0.034 |
| -0.6199239140102164 | 0.553 |
| 0.8045666907697797 | 0.845 |
| -0.9411557586355586 | 0.906 |
| 0.5701828382784497 | 0.99 |
| 0.3376267958312491 | -0.296 |
| -0.34522591020746796 | -0.905 |
| 0.9462558009246749 | 0.029 |
| -0.11048784476753837 | 0.818 |
| 0.13385881290151147 | -0.501 |
| -0.8729163495383694 | -0.7 |
| -0.48018367157285136 | 0.389 |
| 0.1839073974982679 | -0.514 |
| 0.1577300480151096 | 0.632 |
| -0.8619508897772648 | 0.012 |
| 0.05008493480535203 | -0.905 |
| -0.6810232832902765 | -0.518 |
| 0.5071025293350548 | -0.807 |
| -0.12008857278588536 | -0.859 |
| -0.10108755655544233 | -0.377 |
| -0.9091158274297153 | 0.35 |
| -0.9324372250968362 | 0.788 |
| -0.3524164476395082 | -0.956 |
| -0.9366415327595385 | -0.422 |
| -0.6366809821796902 | 0.477 |
| 0.4421188441434696 | 0.325 |
| -0.868189888676622 | 0.493 |
| -0.8608878210805799 | 0.523 |
| 0.9306739100990171 | 0.705 |
| 0.882498899102351 | -0.194 |
| 0.9509465703319131 | 0.121 |
| 0.4558320256552235 | 0.273 |
| 0.16533650573555247 | 0.626 |
| -0.3485532249283947 | -0.694 |
| 0.821122034191341 | -0.782 |
| 0.3759717220709986 | -0.726 |
| -0.8286141304901158 | 0.247 |
| -0.20741886987553948 | 0.978 |
| 0.8888704908135567 | 0.564 |
| 0.9380828317847578 | 0.473 |
| 0.04921896124495384 | -0.65 |
| -0.7481134858566545 | 0.08 |
| 0.26108459688823604 | 0.208 |
| 0.49034372917739155 | 0.992 |
| 0.6138659907193047 | 0.04 |
| -0.8050268188994181 | -0.457 |
| -0.24939079687983035 | -0.616 |
| -0.9699538791497722 | -0.723 |
| -0.8142888502259336 | -0.779 |
| -0.5288579785506751 | 0.032 |
| -0.8886958840017887 | 0.462 |
| 0.744582790208606 | -0.532 |
| -0.9004052193015457 | -0.316 |
| 0.8997635478554051 | -0.626 |
| -0.5583325197290334 | -0.064 |
| 0.63913459065038 | -0.649 |
| -0.6080662004349993 | -0.041 |
| -0.5601153813354496 | 0.273 |
| 0.6433183043137918 | -0.19 |
| -0.6275123582355357 | -0.839 |
| -0.011043355118148579 | -0.423 |
| 0.05872372802168235 | 0.399 |
| -0.08732020950389696 | -0.248 |
| -0.12570685835376905 | -0.258 |
| -0.5064627793945826 | 0.226 |
| 0.26273115178244 | 0.326 |
| -0.31666722277112935 | 0.819 |
| -0.1416965931819263 | -0.892 |
| 0.10311864156025252 | -0.353 |
| -0.18635716562554516 | 0.306 |
| 0.492224472181783 | 0.192 |
| 0.3454227162967678 | -0.204 |
| 0.535281338448403 | -0.053 |
| 0.4245738429347894 | -0.424 |
| -0.9755991511751705 | 0.016 |
| 0.8473750534900777 | 0.052 |
| 0.9893137444161988 | 0.002 |
| 0.7614802686323008 | -0.138 |
| 0.5058097515296056 | 0.147 |
| -0.3369738130623723 | -0.897 |
| -0.8021311853607678 | -0.087 |
| -0.9246450899177157 | 0.594 |
| -0.3277288370160374 | 0.609 |
| -0.2735411505099232 | 0.84 |
| 5.903582505628613e-05 | 0.679 |
| -0.7950767751668668 | 0.269 |
| -0.855164217871925 | -0.436 |
| -0.6418150144351684 | 0.596 |
| -0.5921751454704565 | 0.75 |
| 0.7943516481223758 | -0.384 |
| -0.14407266047217604 | 0.918 |
| -0.25990801618093307 | 0.921 |
| -0.2827027724721194 | -0.009 |
| 0.20651348262904667 | 0.413 |
| 0.4935033369424866 | 0.715 |
| 0.31265328533146164 | -0.548 |
| -0.9406918605384933 | -0.117 |
| 0.4800326366338308 | 0.634 |
| 0.6739511165484504 | -0.756 |
| 0.6561684833475758 | 0.965 |
| -0.5922312519453639 | -0.58 |
| -0.408855331116615 | 0.42 |
| -0.051447581832825495 | 0.143 |
| 0.2180585508860733 | -0.44 |
| -0.24353112595492798 | -0.898 |
| 0.679414623518021 | -0.394 |
| -0.9337071832517121 | 0.951 |
| 0.582120308113927 | 0.125 |
| -0.6801108312125865 | -0.551 |
| -0.07160743429375782 | 0.342 |
| 0.5104922627432631 | 0.234 |
| 0.012102393436347558 | -0.897 |
| 0.49441478795321925 | 0.518 |
| -0.40744389157114114 | 0.412 |
| -0.7011205427386877 | 0.692 |
| 0.4963755450932772 | 0.658 |
| -0.9870443722130524 | 0.86 |
| -0.4418091129205364 | -0.83 |
| 0.28691291105687977 | 0.703 |
| 0.1444509160601124 | -0.057 |
| -0.24133486334639853 | -0.694 |
| 0.3254230383584107 | -0.896 |
| 0.2672506361780884 | -0.652 |
| -0.6113186860645166 | -0.484 |
| -0.9334675494368483 | -0.982 |
| -0.6158118123569472 | -0.951 |
| -0.7671931227715238 | -0.284 |
| 0.9839281639061874 | -0.605 |
| 0.1524673539430239 | 0.41 |
| -0.5668577865727533 | -0.132 |
| -0.7045834587096167 | -0.303 |
| -0.4003482942546368 | 0.211 |
| -0.9375991204797098 | 0.515 |
| -0.07760758165116477 | -0.949 |
| -0.49690183787023035 | -0.453 |
| -0.6249177615387356 | 0.77 |
| 0.24393773923284257 | -0.208 |
| 0.12676094750768563 | -0.556 |
| -0.49298434228607824 | -0.475 |
| 0.2703162685734175 | -0.143 |
| -0.42292459114973613 | 0.94 |
| 0.8245927757367228 | -0.467 |
| -0.6068689573172377 | 0.566 |